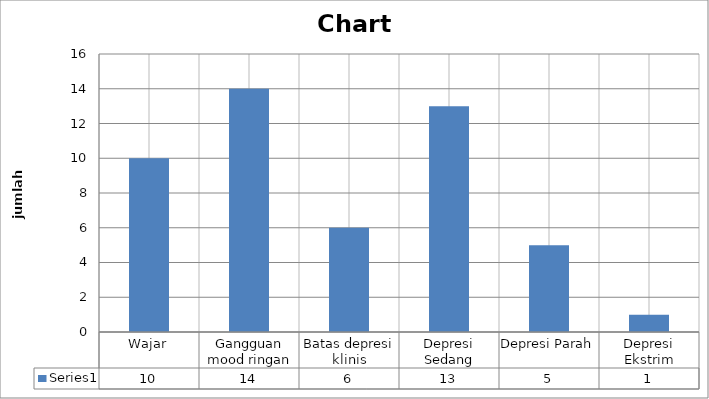
| Category | Series 0 |
|---|---|
| Wajar | 10 |
| Gangguan mood ringan | 14 |
| Batas depresi klinis | 6 |
| Depresi Sedang | 13 |
| Depresi Parah | 5 |
| Depresi Ekstrim | 1 |